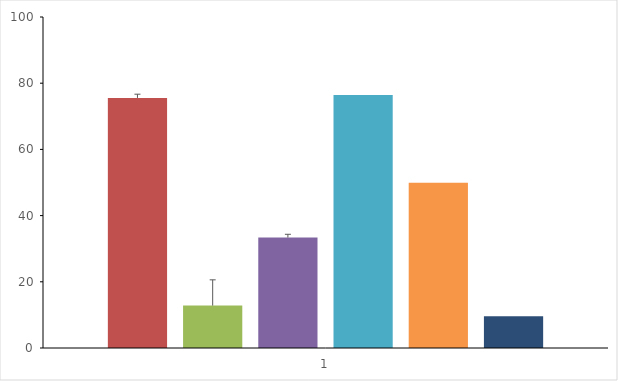
| Category | MDL100907-S | RS127445 | RS10221 | 5-HT-S | MDL-S | RS10221-S | Rs127445-S |
|---|---|---|---|---|---|---|---|
| 0 | 75.548 | 12.805 | 33.352 |  | 76.419 | 49.917 | 9.606 |